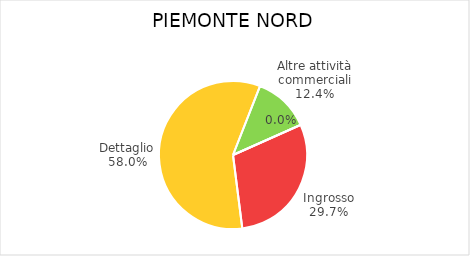
| Category | Piemonte Nord |
|---|---|
| Ingrosso | 6348 |
| Dettaglio | 12404 |
| Altre attività commerciali | 2651 |